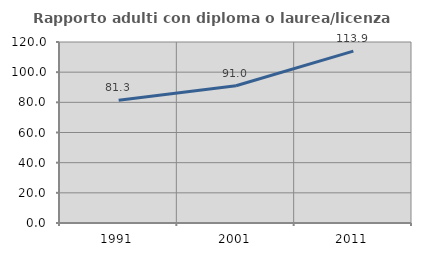
| Category | Rapporto adulti con diploma o laurea/licenza media  |
|---|---|
| 1991.0 | 81.333 |
| 2001.0 | 90.958 |
| 2011.0 | 113.934 |